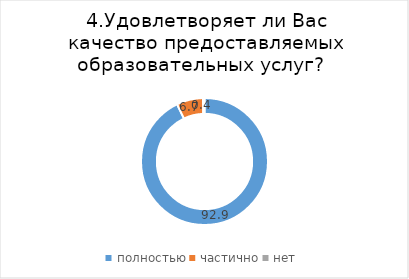
| Category | Series 0 |
|---|---|
| полностью | 92.898 |
| частично | 6.718 |
| нет | 0.384 |